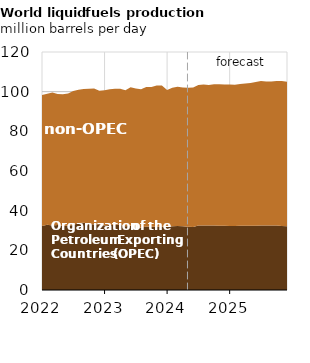
| Category | OPEC Countries | non-OPEC Countries |
|---|---|---|
| 2022-01-01 | 32.234 | 66.031 |
| 2022-02-01 | 32.842 | 66.151 |
| 2022-03-01 | 32.486 | 67.152 |
| 2022-04-01 | 32.73 | 66.048 |
| 2022-05-01 | 32.281 | 66.421 |
| 2022-06-01 | 32.456 | 66.662 |
| 2022-07-01 | 32.768 | 67.573 |
| 2022-08-01 | 33.759 | 67.208 |
| 2022-09-01 | 33.874 | 67.488 |
| 2022-10-01 | 33.446 | 68.059 |
| 2022-11-01 | 33.085 | 68.496 |
| 2022-12-01 | 33.212 | 67.303 |
| 2023-01-01 | 32.58 | 68.087 |
| 2023-02-01 | 32.778 | 68.401 |
| 2023-03-01 | 32.967 | 68.51 |
| 2023-04-01 | 32.861 | 68.629 |
| 2023-05-01 | 32.148 | 68.629 |
| 2023-06-01 | 32.371 | 69.821 |
| 2023-07-01 | 31.548 | 69.998 |
| 2023-08-01 | 31.364 | 69.883 |
| 2023-09-01 | 31.988 | 70.306 |
| 2023-10-01 | 31.854 | 70.537 |
| 2023-11-01 | 31.905 | 71.235 |
| 2023-12-01 | 31.892 | 71.228 |
| 2024-01-01 | 31.804 | 69.043 |
| 2024-02-01 | 32.082 | 69.933 |
| 2024-03-01 | 32.244 | 70.286 |
| 2024-04-01 | 32.138 | 69.945 |
| 2024-05-01 | 31.858 | 70.099 |
| 2024-06-01 | 31.74 | 70.382 |
| 2024-07-01 | 32.487 | 70.89 |
| 2024-08-01 | 32.536 | 71.047 |
| 2024-09-01 | 32.54 | 70.883 |
| 2024-10-01 | 32.479 | 71.214 |
| 2024-11-01 | 32.352 | 71.437 |
| 2024-12-01 | 32.427 | 71.221 |
| 2025-01-01 | 32.3 | 71.347 |
| 2025-02-01 | 32.299 | 71.165 |
| 2025-03-01 | 32.397 | 71.424 |
| 2025-04-01 | 32.439 | 71.722 |
| 2025-05-01 | 32.437 | 71.928 |
| 2025-06-01 | 32.436 | 72.488 |
| 2025-07-01 | 32.579 | 72.854 |
| 2025-08-01 | 32.577 | 72.551 |
| 2025-09-01 | 32.576 | 72.545 |
| 2025-10-01 | 32.468 | 72.862 |
| 2025-11-01 | 32.267 | 73.092 |
| 2025-12-01 | 32.167 | 72.85 |